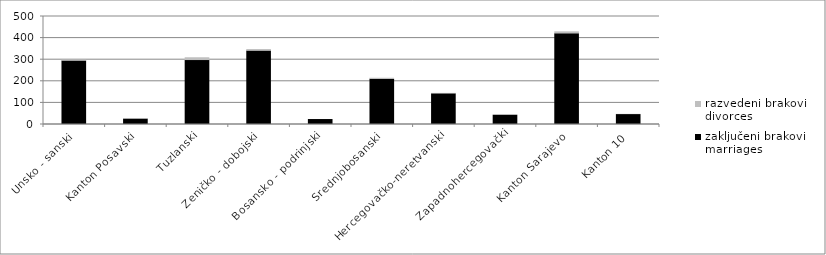
| Category | zaključeni brakovi
marriages | razvedeni brakovi
divorces |
|---|---|---|
| Unsko - sanski | 294 | 4 |
| Kanton Posavski | 25 | 2 |
| Tuzlanski | 296 | 13 |
| Zeničko - dobojski | 340 | 7 |
| Bosansko - podrinjski | 23 | 0 |
| Srednjobosanski | 209 | 5 |
| Hercegovačko-neretvanski | 142 | 2 |
| Zapadnohercegovački | 43 | 1 |
| Kanton Sarajevo | 420 | 9 |
| Kanton 10 | 46 | 1 |